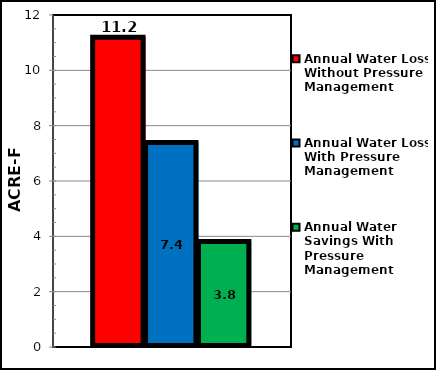
| Category | Annual Water Loss Without Pressure Management | Annual Water Loss With Pressure Management | Annual Water Savings With Pressure Management |
|---|---|---|---|
| 0 | 11.2 | 7.39 | 3.81 |